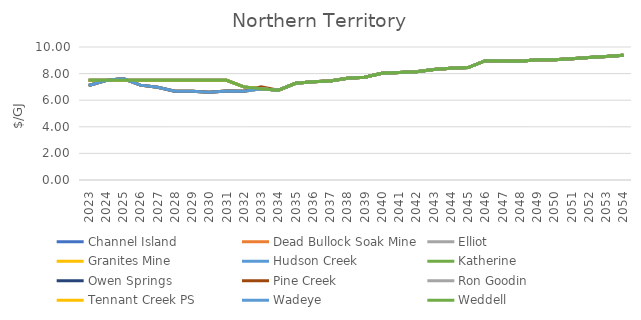
| Category | Channel Island | Dead Bullock Soak Mine | Elliot | Granites Mine | Hudson Creek | Katherine | Owen Springs | Pine Creek | Ron Goodin | Tennant Creek PS | Wadeye | Weddell |
|---|---|---|---|---|---|---|---|---|---|---|---|---|
| 2023.0 | 7.5 | 7.102 | 7.102 | 7.102 | 7.102 | 7.5 | 7.5 | 7.102 | 7.5 | 7.5 | 7.102 | 7.5 |
| 2024.0 | 7.5 | 7.475 | 7.475 | 7.475 | 7.475 | 7.5 | 7.5 | 7.475 | 7.5 | 7.5 | 7.475 | 7.5 |
| 2025.0 | 7.5 | 7.626 | 7.626 | 7.626 | 7.626 | 7.5 | 7.5 | 7.626 | 7.5 | 7.5 | 7.626 | 7.5 |
| 2026.0 | 7.5 | 7.134 | 7.134 | 7.134 | 7.134 | 7.5 | 7.5 | 7.134 | 7.5 | 7.5 | 7.134 | 7.5 |
| 2027.0 | 7.5 | 6.978 | 6.978 | 6.978 | 6.978 | 7.5 | 7.5 | 6.978 | 7.5 | 7.5 | 6.978 | 7.5 |
| 2028.0 | 7.5 | 6.676 | 6.676 | 6.676 | 6.676 | 7.5 | 7.5 | 6.676 | 7.5 | 7.5 | 6.676 | 7.5 |
| 2029.0 | 7.5 | 6.674 | 6.674 | 6.674 | 6.674 | 7.5 | 7.5 | 6.674 | 7.5 | 7.5 | 6.674 | 7.5 |
| 2030.0 | 7.5 | 6.599 | 6.599 | 6.599 | 6.599 | 7.5 | 7.5 | 6.599 | 7.5 | 7.5 | 6.599 | 7.5 |
| 2031.0 | 7.5 | 6.692 | 6.692 | 6.692 | 6.692 | 7.5 | 7.5 | 6.692 | 7.5 | 7.5 | 6.692 | 7.5 |
| 2032.0 | 7 | 6.68 | 6.68 | 6.68 | 6.68 | 7 | 7 | 6.68 | 7 | 7 | 6.68 | 7 |
| 2033.0 | 6.863 | 6.863 | 6.863 | 6.863 | 6.863 | 6.863 | 6.863 | 7 | 6.863 | 6.863 | 6.863 | 6.863 |
| 2034.0 | 6.756 | 6.756 | 6.756 | 6.756 | 6.756 | 6.756 | 6.756 | 6.756 | 6.756 | 6.756 | 6.756 | 6.756 |
| 2035.0 | 7.267 | 7.267 | 7.267 | 7.267 | 7.267 | 7.267 | 7.267 | 7.267 | 7.267 | 7.267 | 7.267 | 7.267 |
| 2036.0 | 7.386 | 7.386 | 7.386 | 7.386 | 7.386 | 7.386 | 7.386 | 7.386 | 7.386 | 7.386 | 7.386 | 7.386 |
| 2037.0 | 7.443 | 7.443 | 7.443 | 7.443 | 7.443 | 7.443 | 7.443 | 7.443 | 7.443 | 7.443 | 7.443 | 7.443 |
| 2038.0 | 7.653 | 7.653 | 7.653 | 7.653 | 7.653 | 7.653 | 7.653 | 7.653 | 7.653 | 7.653 | 7.653 | 7.653 |
| 2039.0 | 7.727 | 7.727 | 7.727 | 7.727 | 7.727 | 7.727 | 7.727 | 7.727 | 7.727 | 7.727 | 7.727 | 7.727 |
| 2040.0 | 8.025 | 8.025 | 8.025 | 8.025 | 8.025 | 8.025 | 8.025 | 8.025 | 8.025 | 8.025 | 8.025 | 8.025 |
| 2041.0 | 8.079 | 8.079 | 8.079 | 8.079 | 8.079 | 8.079 | 8.079 | 8.079 | 8.079 | 8.079 | 8.079 | 8.079 |
| 2042.0 | 8.132 | 8.132 | 8.132 | 8.132 | 8.132 | 8.132 | 8.132 | 8.132 | 8.132 | 8.132 | 8.132 | 8.132 |
| 2043.0 | 8.311 | 8.311 | 8.311 | 8.311 | 8.311 | 8.311 | 8.311 | 8.311 | 8.311 | 8.311 | 8.311 | 8.311 |
| 2044.0 | 8.395 | 8.395 | 8.395 | 8.395 | 8.395 | 8.395 | 8.395 | 8.395 | 8.395 | 8.395 | 8.395 | 8.395 |
| 2045.0 | 8.449 | 8.449 | 8.449 | 8.449 | 8.449 | 8.449 | 8.449 | 8.449 | 8.449 | 8.449 | 8.449 | 8.449 |
| 2046.0 | 8.968 | 8.968 | 8.968 | 8.968 | 8.968 | 8.968 | 8.968 | 8.968 | 8.968 | 8.968 | 8.968 | 8.968 |
| 2047.0 | 8.943 | 8.943 | 8.943 | 8.943 | 8.943 | 8.943 | 8.943 | 8.943 | 8.943 | 8.943 | 8.943 | 8.943 |
| 2048.0 | 8.934 | 8.934 | 8.934 | 8.934 | 8.934 | 8.934 | 8.934 | 8.934 | 8.934 | 8.934 | 8.934 | 8.934 |
| 2049.0 | 9.034 | 9.034 | 9.034 | 9.034 | 9.034 | 9.034 | 9.034 | 9.034 | 9.034 | 9.034 | 9.034 | 9.034 |
| 2050.0 | 9.034 | 9.034 | 9.034 | 9.034 | 9.034 | 9.034 | 9.034 | 9.034 | 9.034 | 9.034 | 9.034 | 9.034 |
| 2051.0 | 9.119 | 9.119 | 9.119 | 9.119 | 9.119 | 9.119 | 9.119 | 9.119 | 9.119 | 9.119 | 9.119 | 9.119 |
| 2052.0 | 9.204 | 9.204 | 9.204 | 9.204 | 9.204 | 9.204 | 9.204 | 9.204 | 9.204 | 9.204 | 9.204 | 9.204 |
| 2053.0 | 9.29 | 9.29 | 9.29 | 9.29 | 9.29 | 9.29 | 9.29 | 9.29 | 9.29 | 9.29 | 9.29 | 9.29 |
| 2054.0 | 9.378 | 9.378 | 9.378 | 9.378 | 9.378 | 9.378 | 9.378 | 9.378 | 9.378 | 9.378 | 9.378 | 9.378 |